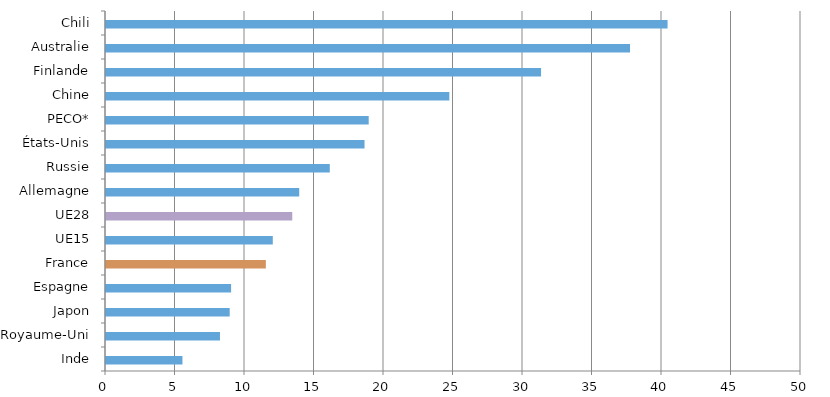
| Category | Series 0 | Series 1 | Series 2 | Series 3 | Series 4 | Series 5 | Series 6 |
|---|---|---|---|---|---|---|---|
| Inde | 5.5 |  |  |  |  |  |  |
| Royaume-Uni | 8.2 |  |  |  |  |  |  |
| Japon | 8.9 |  |  |  |  |  |  |
| Espagne | 9 |  |  |  |  |  |  |
| France | 11.5 |  |  |  |  |  |  |
| UE15 | 12 |  |  |  |  |  |  |
| UE28 | 13.4 |  |  |  |  |  |  |
| Allemagne | 13.9 |  |  |  |  |  |  |
| Russie | 16.1 |  |  |  |  |  |  |
| États-Unis | 18.6 |  |  |  |  |  |  |
| PECO* | 18.9 |  |  |  |  |  |  |
| Chine | 24.7 |  |  |  |  |  |  |
| Finlande | 31.3 |  |  |  |  |  |  |
| Australie | 37.7 |  |  |  |  |  |  |
| Chili | 40.4 |  |  |  |  |  |  |